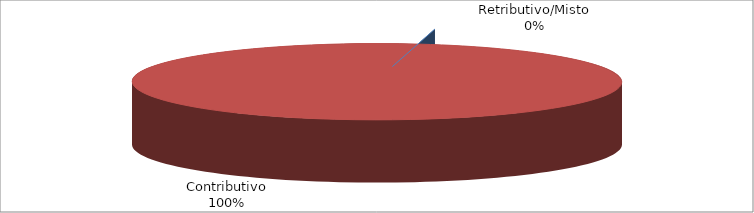
| Category | Series 1 |
|---|---|
| Retributivo/Misto | 0 |
| Contributivo | 20939 |